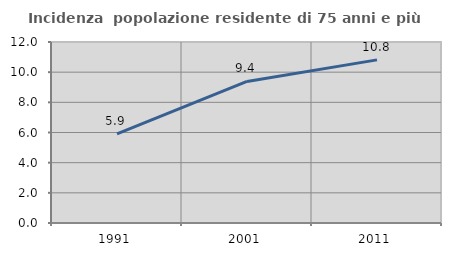
| Category | Incidenza  popolazione residente di 75 anni e più |
|---|---|
| 1991.0 | 5.911 |
| 2001.0 | 9.388 |
| 2011.0 | 10.815 |